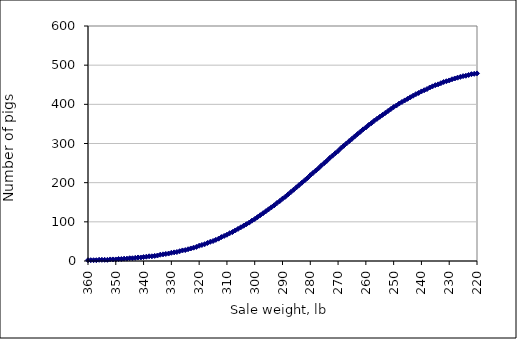
| Category | Series 0 |
|---|---|
| 150.0 | 500 |
| 151.0 | 500 |
| 152.0 | 500 |
| 153.0 | 500 |
| 154.0 | 500 |
| 155.0 | 500 |
| 156.0 | 500 |
| 157.0 | 500 |
| 158.0 | 500 |
| 159.0 | 500 |
| 160.0 | 500 |
| 161.0 | 500 |
| 162.0 | 500 |
| 163.0 | 500 |
| 164.0 | 500 |
| 165.0 | 500 |
| 166.0 | 500 |
| 167.0 | 500 |
| 168.0 | 500 |
| 169.0 | 500 |
| 170.0 | 500 |
| 171.0 | 500 |
| 172.0 | 500 |
| 173.0 | 500 |
| 174.0 | 500 |
| 175.0 | 500 |
| 176.0 | 500 |
| 177.0 | 500 |
| 178.0 | 499 |
| 179.0 | 499 |
| 180.0 | 499 |
| 181.0 | 499 |
| 182.0 | 499 |
| 183.0 | 499 |
| 184.0 | 499 |
| 185.0 | 499 |
| 186.0 | 499 |
| 187.0 | 499 |
| 188.0 | 499 |
| 189.0 | 498 |
| 190.0 | 498 |
| 191.0 | 498 |
| 192.0 | 498 |
| 193.0 | 498 |
| 194.0 | 497 |
| 195.0 | 497 |
| 196.0 | 497 |
| 197.0 | 497 |
| 198.0 | 496 |
| 199.0 | 496 |
| 200.0 | 496 |
| 201.0 | 495 |
| 202.0 | 495 |
| 203.0 | 494 |
| 204.0 | 494 |
| 205.0 | 493 |
| 206.0 | 493 |
| 207.0 | 492 |
| 208.0 | 491 |
| 209.0 | 491 |
| 210.0 | 490 |
| 211.0 | 489 |
| 212.0 | 488 |
| 213.0 | 488 |
| 214.0 | 487 |
| 215.0 | 486 |
| 216.0 | 484 |
| 217.0 | 483 |
| 218.0 | 482 |
| 219.0 | 481 |
| 220.0 | 479 |
| 221.0 | 478 |
| 222.0 | 477 |
| 223.0 | 475 |
| 224.0 | 473 |
| 225.0 | 472 |
| 226.0 | 470 |
| 227.0 | 468 |
| 228.0 | 466 |
| 229.0 | 464 |
| 230.0 | 461 |
| 231.0 | 459 |
| 232.0 | 457 |
| 233.0 | 454 |
| 234.0 | 451 |
| 235.0 | 449 |
| 236.0 | 446 |
| 237.0 | 443 |
| 238.0 | 439 |
| 239.0 | 436 |
| 240.0 | 433 |
| 241.0 | 429 |
| 242.0 | 426 |
| 243.0 | 422 |
| 244.0 | 418 |
| 245.0 | 414 |
| 246.0 | 410 |
| 247.0 | 406 |
| 248.0 | 402 |
| 249.0 | 397 |
| 250.0 | 393 |
| 251.0 | 388 |
| 252.0 | 383 |
| 253.0 | 378 |
| 254.0 | 373 |
| 255.0 | 368 |
| 256.0 | 363 |
| 257.0 | 358 |
| 258.0 | 352 |
| 259.0 | 347 |
| 260.0 | 341 |
| 261.0 | 336 |
| 262.0 | 330 |
| 263.0 | 324 |
| 264.0 | 318 |
| 265.0 | 312 |
| 266.0 | 306 |
| 267.0 | 300 |
| 268.0 | 294 |
| 269.0 | 288 |
| 270.0 | 281 |
| 271.0 | 275 |
| 272.0 | 269 |
| 273.0 | 263 |
| 274.0 | 256 |
| 275.0 | 250 |
| 276.0 | 244 |
| 277.0 | 237 |
| 278.0 | 231 |
| 279.0 | 225 |
| 280.0 | 219 |
| 281.0 | 212 |
| 282.0 | 206 |
| 283.0 | 200 |
| 284.0 | 194 |
| 285.0 | 188 |
| 286.0 | 182 |
| 287.0 | 176 |
| 288.0 | 170 |
| 289.0 | 164 |
| 290.0 | 159 |
| 291.0 | 153 |
| 292.0 | 148 |
| 293.0 | 142 |
| 294.0 | 137 |
| 295.0 | 132 |
| 296.0 | 127 |
| 297.0 | 122 |
| 298.0 | 117 |
| 299.0 | 112 |
| 300.0 | 107 |
| 301.0 | 103 |
| 302.0 | 98 |
| 303.0 | 94 |
| 304.0 | 90 |
| 305.0 | 86 |
| 306.0 | 82 |
| 307.0 | 78 |
| 308.0 | 74 |
| 309.0 | 71 |
| 310.0 | 67 |
| 311.0 | 64 |
| 312.0 | 61 |
| 313.0 | 57 |
| 314.0 | 54 |
| 315.0 | 51 |
| 316.0 | 49 |
| 317.0 | 46 |
| 318.0 | 43 |
| 319.0 | 41 |
| 320.0 | 39 |
| 321.0 | 36 |
| 322.0 | 34 |
| 323.0 | 32 |
| 324.0 | 30 |
| 325.0 | 28 |
| 326.0 | 27 |
| 327.0 | 25 |
| 328.0 | 23 |
| 329.0 | 22 |
| 330.0 | 21 |
| 331.0 | 19 |
| 332.0 | 18 |
| 333.0 | 17 |
| 334.0 | 16 |
| 335.0 | 14 |
| 336.0 | 13 |
| 337.0 | 12 |
| 338.0 | 12 |
| 339.0 | 11 |
| 340.0 | 10 |
| 341.0 | 9 |
| 342.0 | 9 |
| 343.0 | 8 |
| 344.0 | 7 |
| 345.0 | 7 |
| 346.0 | 6 |
| 347.0 | 6 |
| 348.0 | 5 |
| 349.0 | 5 |
| 350.0 | 4 |
| 351.0 | 4 |
| 352.0 | 4 |
| 353.0 | 3 |
| 354.0 | 3 |
| 355.0 | 3 |
| 356.0 | 3 |
| 357.0 | 2 |
| 358.0 | 2 |
| 359.0 | 2 |
| 360.0 | 2 |
| 361.0 | 2 |
| 362.0 | 1 |
| 363.0 | 1 |
| 364.0 | 1 |
| 365.0 | 1 |
| 366.0 | 1 |
| 367.0 | 1 |
| 368.0 | 1 |
| 369.0 | 1 |
| 370.0 | 1 |
| 371.0 | 1 |
| 372.0 | 1 |
| 373.0 | 0 |
| 374.0 | 0 |
| 375.0 | 0 |